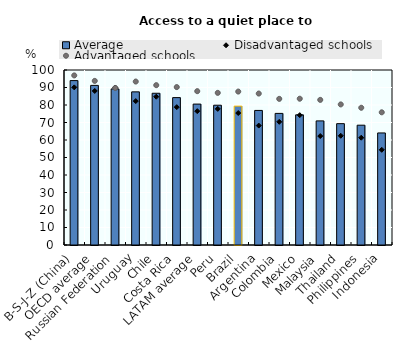
| Category | Average |
|---|---|
| B-S-J-Z (China) | 93.947 |
| OECD average | 91.214 |
| Russian Federation | 89.203 |
| Uruguay | 87.505 |
| Chile | 86.712 |
| Costa Rica | 84.216 |
| LATAM average | 80.519 |
| Peru | 79.879 |
| Brazil | 79.363 |
| Argentina | 76.895 |
| Colombia | 75.2 |
| Mexico | 74.387 |
| Malaysia | 70.923 |
| Thailand | 69.34 |
| Philippines | 68.464 |
| Indonesia | 64.03 |